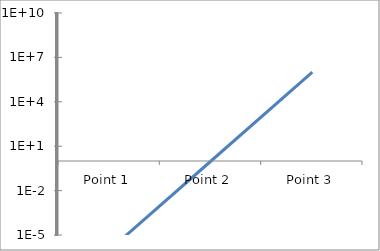
| Category | Series 4 |
|---|---|
| Point 1 | 0 |
| Point 2 | 1 |
| Point 3 | 1000000 |